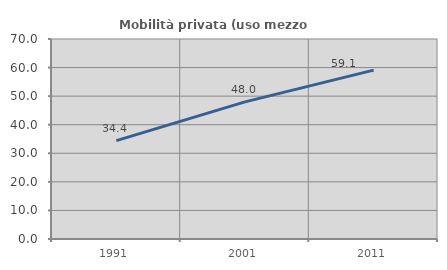
| Category | Mobilità privata (uso mezzo privato) |
|---|---|
| 1991.0 | 34.411 |
| 2001.0 | 47.983 |
| 2011.0 | 59.107 |